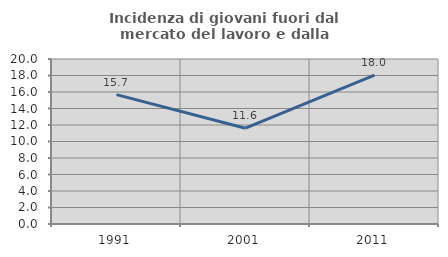
| Category | Incidenza di giovani fuori dal mercato del lavoro e dalla formazione  |
|---|---|
| 1991.0 | 15.686 |
| 2001.0 | 11.613 |
| 2011.0 | 18.045 |